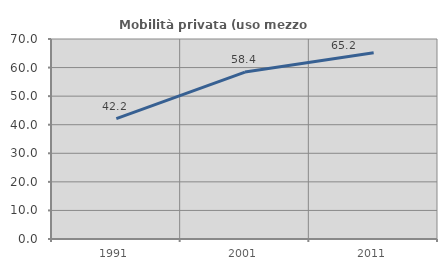
| Category | Mobilità privata (uso mezzo privato) |
|---|---|
| 1991.0 | 42.157 |
| 2001.0 | 58.434 |
| 2011.0 | 65.185 |